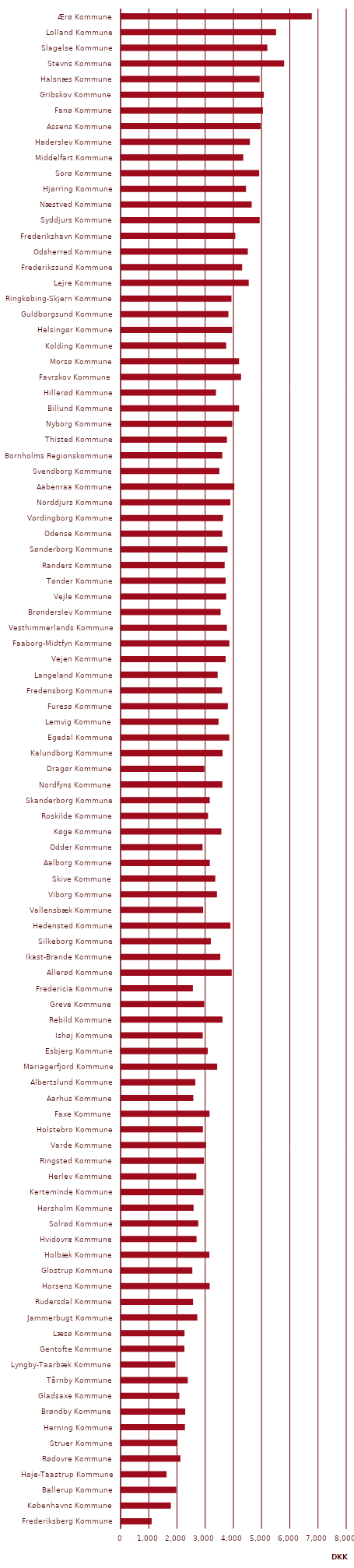
| Category | Spildevand |
|---|---|
| Ærø Kommune | 6752.506 |
| Lolland Kommune | 5483.514 |
| Slagelse Kommune | 5175.673 |
| Stevns Kommune | 5772.29 |
| Halsnæs Kommune | 4902.446 |
| Gribskov Kommune | 5050.891 |
| Fanø Kommune | 5019.664 |
| Assens Kommune | 4943.091 |
| Haderslev Kommune | 4556.58 |
| Middelfart Kommune | 4321.898 |
| Sorø Kommune | 4886.076 |
| Hjørring Kommune | 4418.532 |
| Næstved Kommune | 4621.734 |
| Syddjurs Kommune | 4904.085 |
| Frederikshavn Kommune | 4038.69 |
| Odsherred Kommune | 4484.218 |
| Frederikssund Kommune | 4282.039 |
| Lejre Kommune | 4515.634 |
| Ringkøbing-Skjern Kommune | 3903.972 |
| Guldborgsund Kommune | 3795.178 |
| Helsingør Kommune | 3927.238 |
| Kolding Kommune | 3717.963 |
| Morsø Kommune | 4172.805 |
| Favrskov Kommune | 4243.668 |
| Hillerød Kommune | 3354.86 |
| Billund Kommune | 4175.118 |
| Nyborg Kommune | 3933.49 |
| Thisted Kommune | 3743.18 |
| Bornholms Regionskommune | 3576.889 |
| Svendborg Kommune | 3474.988 |
| Aabenraa Kommune | 4006.07 |
| Norddjurs Kommune | 3864.794 |
| Vordingborg Kommune | 3604.86 |
| Odense Kommune | 3581.269 |
| Sønderborg Kommune | 3763.734 |
| Randers Kommune | 3662.438 |
| Tønder Kommune | 3697.246 |
| Vejle Kommune | 3720.072 |
| Brønderslev Kommune | 3518.409 |
| Vesthimmerlands Kommune | 3741.047 |
| Faaborg-Midtfyn Kommune | 3829.148 |
| Vejen Kommune | 3698.406 |
| Langeland Kommune | 3413.324 |
| Fredensborg Kommune | 3572.087 |
| Furesø Kommune | 3774.217 |
| Lemvig Kommune | 3445.399 |
| Egedal Kommune | 3826.637 |
| Kalundborg Kommune | 3588.652 |
| Dragør Kommune | 2943.89 |
| Nordfyns Kommune | 3581.269 |
| Skanderborg Kommune | 3133.324 |
| Roskilde Kommune | 3073.89 |
| Køge Kommune | 3545.248 |
| Odder Kommune | 2879.047 |
| Aalborg Kommune | 3135.298 |
| Skive Kommune | 3329.654 |
| Viborg Kommune | 3388.409 |
| Vallensbæk Kommune | 2899.438 |
| Hedensted Kommune | 3865.181 |
| Silkeborg Kommune | 3172.395 |
| Ikast-Brande Kommune | 3508.083 |
| Allerød Kommune | 3912.605 |
| Fredericia Kommune | 2534.691 |
| Greve Kommune | 2935.502 |
| Rebild Kommune | 3585.502 |
| Ishøj Kommune | 2885.18 |
| Esbjerg Kommune | 3062.676 |
| Mariagerfjord Kommune | 3396.792 |
| Albertslund Kommune | 2623.081 |
| Aarhus Kommune | 2549.694 |
| Faxe Kommune | 3127.073 |
| Holstebro Kommune | 2891.909 |
| Varde Kommune | 3002.902 |
| Ringsted Kommune | 2923.97 |
| Herlev Kommune | 2656.63 |
| Kerteminde Kommune | 2911.306 |
| Hørsholm Kommune | 2561.436 |
| Solrød Kommune | 2725.824 |
| Hvidovre Kommune | 2665.017 |
| Holbæk Kommune | 3120.502 |
| Glostrup Kommune | 2516.145 |
| Horsens Kommune | 3131.306 |
| Rudersdal Kommune | 2541.306 |
| Jammerbugt Kommune | 2692.174 |
| Læsø Kommune | 2239.729 |
| Gentofte Kommune | 2235.175 |
| Lyngby-Taarbæk Kommune | 1913.319 |
| Tårnby Kommune | 2355.95 |
| Gladsaxe Kommune | 2054.852 |
| Brøndby Kommune | 2264.53 |
| Herning Kommune | 2254.047 |
| Struer Kommune | 1991.948 |
| Rødovre Kommune | 2093.642 |
| Høje-Taastrup Kommune | 1602.994 |
| Ballerup Kommune | 1943.303 |
| Københavns Kommune | 1755.011 |
| Frederiksberg Kommune | 1073.555 |